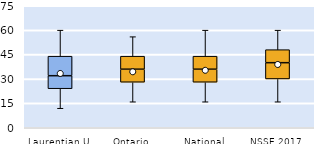
| Category | 25th | 50th | 75th |
|---|---|---|---|
| Laurentian U | 24 | 8 | 12 |
| Ontario | 28 | 8 | 8 |
| National | 28 | 8 | 8 |
| NSSE 2017 | 30 | 10 | 8 |